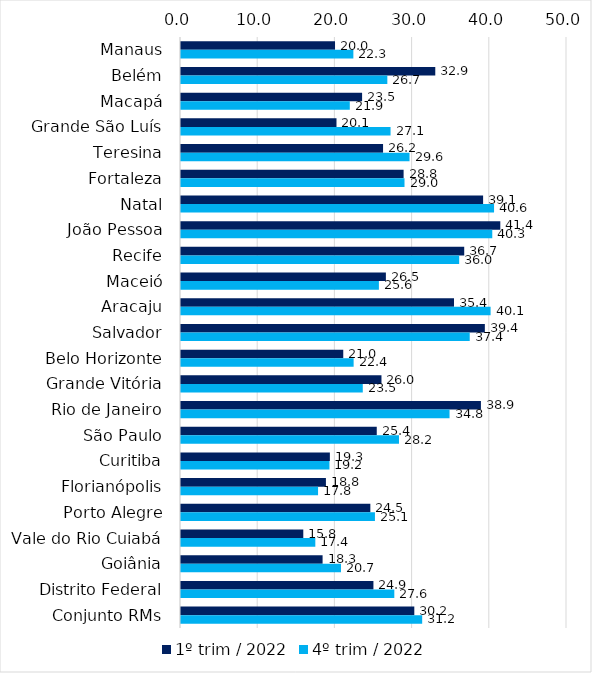
| Category | 1º trim / 2022 | 4º trim / 2022 |
|---|---|---|
| Manaus | 19.952 | 22.327 |
| Belém | 32.937 | 26.727 |
| Macapá | 23.457 | 21.865 |
| Grande São Luís | 20.141 | 27.145 |
| Teresina | 26.173 | 29.602 |
| Fortaleza | 28.835 | 28.951 |
| Natal | 39.133 | 40.552 |
| João Pessoa | 41.36 | 40.321 |
| Recife | 36.686 | 36.033 |
| Maceió | 26.539 | 25.634 |
| Aracaju | 35.363 | 40.103 |
| Salvador | 39.358 | 37.4 |
| Belo Horizonte | 21.017 | 22.362 |
| Grande Vitória | 25.968 | 23.546 |
| Rio de Janeiro | 38.85 | 34.786 |
| São Paulo | 25.357 | 28.236 |
| Curitiba | 19.284 | 19.229 |
| Florianópolis | 18.771 | 17.753 |
| Porto Alegre | 24.527 | 25.122 |
| Vale do Rio Cuiabá | 15.84 | 17.399 |
| Goiânia | 18.341 | 20.722 |
| Distrito Federal | 24.926 | 27.631 |
| Conjunto RMs | 30.221 | 31.241 |